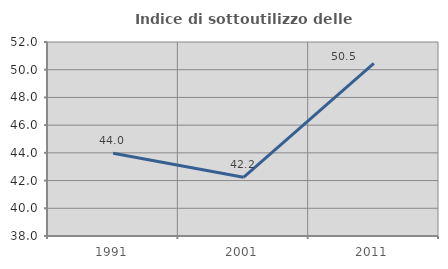
| Category | Indice di sottoutilizzo delle abitazioni  |
|---|---|
| 1991.0 | 43.976 |
| 2001.0 | 42.233 |
| 2011.0 | 50.459 |